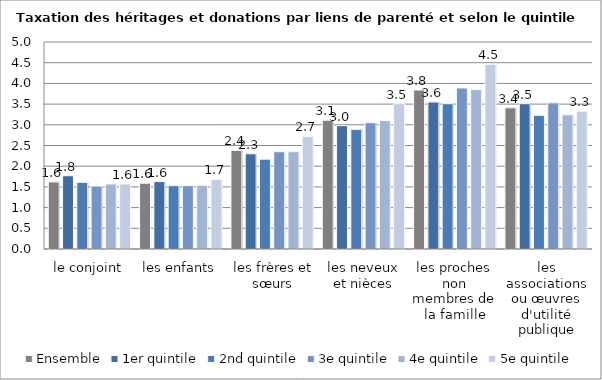
| Category | Ensemble | 1er quintile | 2nd quintile | 3e quintile | 4e quintile | 5e quintile |
|---|---|---|---|---|---|---|
| le conjoint | 1.62 | 1.77 | 1.61 | 1.52 | 1.57 | 1.57 |
| les enfants | 1.59 | 1.63 | 1.53 | 1.53 | 1.54 | 1.68 |
| les frères et sœurs | 2.38 | 2.3 | 2.17 | 2.35 | 2.35 | 2.72 |
| les neveux et nièces | 3.11 | 2.98 | 2.89 | 3.05 | 3.1 | 3.51 |
| les proches non membres de la famille | 3.84 | 3.55 | 3.51 | 3.89 | 3.85 | 4.46 |
| les associations ou œuvres d'utilité publique | 3.41 | 3.51 | 3.23 | 3.53 | 3.24 | 3.33 |